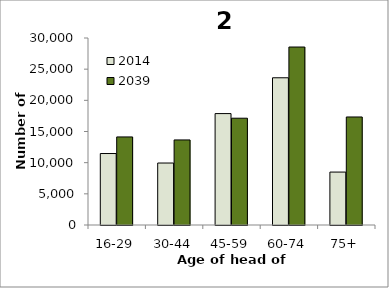
| Category | 2014 | 2039 |
|---|---|---|
| 16-29 | 11466 | 14129 |
| 30-44 | 9943 | 13648 |
| 45-59 | 17874 | 17133 |
| 60-74 | 23619 | 28553 |
| 75+ | 8492 | 17331 |